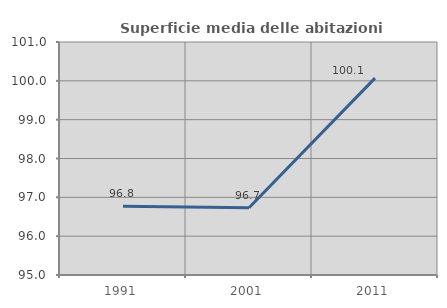
| Category | Superficie media delle abitazioni occupate |
|---|---|
| 1991.0 | 96.769 |
| 2001.0 | 96.731 |
| 2011.0 | 100.07 |